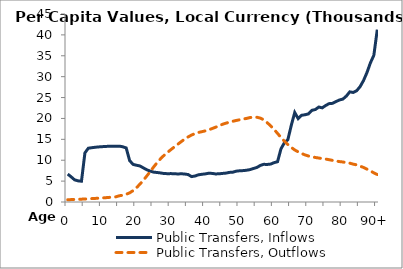
| Category | Public Transfers, Inflows | Public Transfers, Outflows |
|---|---|---|
| 0 | 6674.916 | 542.08 |
|  | 6019.898 | 573.396 |
| 2 | 5301.879 | 606.522 |
| 3 | 5066.112 | 641.692 |
| 4 | 4971.349 | 680.228 |
| 5 | 11756.64 | 721.63 |
| 6 | 12881.12 | 765.572 |
| 7 | 12993.98 | 810.54 |
| 8 | 13106.37 | 859.467 |
| 9 | 13184 | 912.216 |
| 10 | 13240.04 | 969.866 |
| 11 | 13309.03 | 1029.849 |
| 12 | 13322.33 | 1098.943 |
| 13 | 13313.78 | 1166.517 |
| 14 | 13315.36 | 1230.92 |
| 15 | 13369.54 | 1496.66 |
| 16 | 13221.97 | 1634.62 |
| 17 | 12946.06 | 1846.956 |
| 18 | 9914.577 | 2193.253 |
| 19 | 9003.87 | 2719.256 |
| 20 | 8799.369 | 3426.388 |
| 21 | 8624.283 | 4276.961 |
| 22 | 8160.2 | 5219.133 |
| 23 | 7708.976 | 6240.717 |
| 24 | 7389.189 | 7307.979 |
| 25 | 7147.604 | 8398.918 |
| 26 | 7057.066 | 9442.833 |
| 27 | 6957.607 | 10352.71 |
| 28 | 6817.584 | 11163 |
| 29 | 6780.284 | 11870.26 |
| 30 | 6794.963 | 12538.6 |
| 31 | 6771.763 | 13178.71 |
| 32 | 6707.309 | 13830.75 |
| 33 | 6756.094 | 14448.77 |
| 34 | 6701.11 | 15050.62 |
| 35 | 6570.211 | 15572.08 |
| 36 | 6081.609 | 16025.47 |
| 37 | 6213.225 | 16371.02 |
| 38 | 6514.222 | 16650.54 |
| 39 | 6630.479 | 16828.1 |
| 40 | 6731.396 | 17026.92 |
| 41 | 6884.716 | 17272.58 |
| 42 | 6843.816 | 17585.07 |
| 43 | 6717.309 | 17907.76 |
| 44 | 6750.819 | 18270.83 |
| 45 | 6840.632 | 18597.51 |
| 46 | 6917.236 | 18866.08 |
| 47 | 7085.344 | 19114.14 |
| 48 | 7140.832 | 19321.3 |
| 49 | 7378.049 | 19523.15 |
| 50 | 7478.014 | 19687.46 |
| 51 | 7514.814 | 19863.66 |
| 52 | 7600.703 | 20008.38 |
| 53 | 7756.132 | 20212.63 |
| 54 | 8018.118 | 20295.34 |
| 55 | 8268.247 | 20281.8 |
| 56 | 8755.246 | 20079.43 |
| 57 | 9016.775 | 19669.86 |
| 58 | 8986.106 | 18992.74 |
| 59 | 9077.107 | 18218.26 |
| 60 | 9421.15 | 17373.74 |
| 61 | 9639.742 | 16416.95 |
| 62 | 12725.52 | 15447.88 |
| 63 | 14188.89 | 14546.87 |
| 64 | 14920.02 | 13762.98 |
| 65 | 18362.84 | 13054.98 |
| 66 | 21417.49 | 12461.06 |
| 67 | 19970.26 | 11991.67 |
| 68 | 20760.2 | 11610.33 |
| 69 | 20885.16 | 11265.41 |
| 70 | 21088.75 | 10999.28 |
| 71 | 21946.51 | 10812.01 |
| 72 | 22133.25 | 10654.14 |
| 73 | 22731.32 | 10521.44 |
| 74 | 22538.36 | 10406.38 |
| 75 | 23102.61 | 10273.14 |
| 76 | 23544.13 | 10124.01 |
| 77 | 23614.96 | 9964.47 |
| 78 | 24039.44 | 9811.586 |
| 79 | 24419.36 | 9671.67 |
| 80 | 24635.65 | 9579.832 |
| 81 | 25346.92 | 9429.724 |
| 82 | 26361.15 | 9298.729 |
| 83 | 26219.78 | 9060.303 |
| 84 | 26633.58 | 8890.547 |
| 85 | 27607.47 | 8584.55 |
| 86 | 29072.56 | 8269.042 |
| 87 | 30982.69 | 7860.327 |
| 88 | 33296.87 | 7432.539 |
| 89 | 35119.26 | 6978.585 |
| 90+ | 41269.91 | 6579.24 |